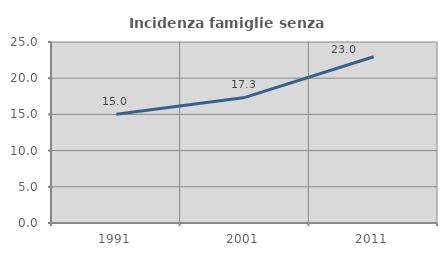
| Category | Incidenza famiglie senza nuclei |
|---|---|
| 1991.0 | 15.021 |
| 2001.0 | 17.348 |
| 2011.0 | 22.967 |